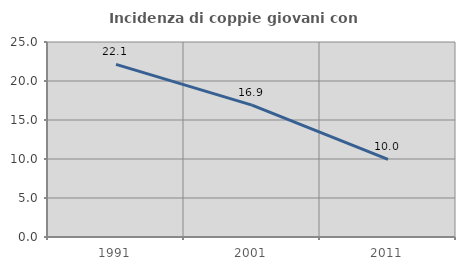
| Category | Incidenza di coppie giovani con figli |
|---|---|
| 1991.0 | 22.139 |
| 2001.0 | 16.899 |
| 2011.0 | 9.957 |